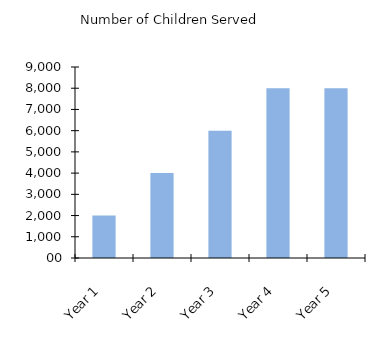
| Category | Number of Children Served |
|---|---|
| 1.0 | 2000 |
| 2.0 | 4000 |
| 3.0 | 6000 |
| 4.0 | 8000 |
| 5.0 | 8000 |